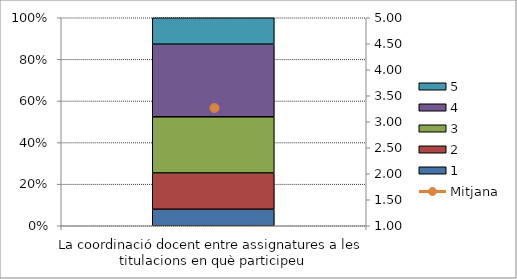
| Category | 1 | 2 | 3 | 4 | 5 |
|---|---|---|---|---|---|
| La coordinació docent entre assignatures a les titulacions en què participeu | 5 | 11 | 17 | 22 | 8 |